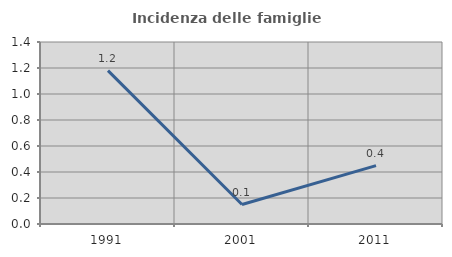
| Category | Incidenza delle famiglie numerose |
|---|---|
| 1991.0 | 1.18 |
| 2001.0 | 0.15 |
| 2011.0 | 0.449 |